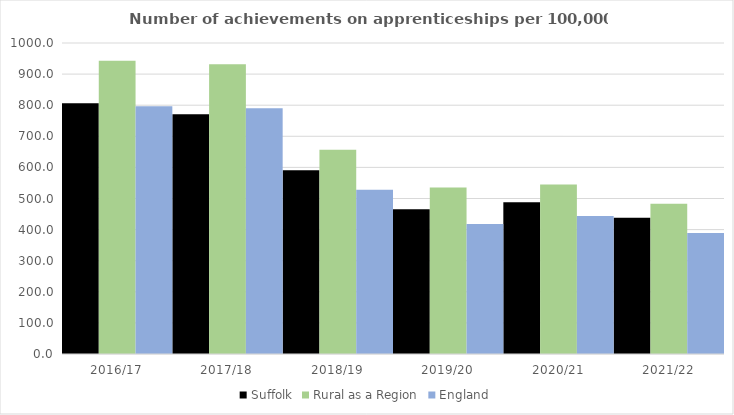
| Category | Suffolk | Rural as a Region | England |
|---|---|---|---|
| 2016/17 | 806.322 | 942.594 | 797 |
| 2017/18 | 771.191 | 931.709 | 790 |
| 2018/19 | 590.568 | 656.44 | 528 |
| 2019/20 | 465.823 | 535.552 | 418 |
| 2020/21 | 487.765 | 545.333 | 444 |
| 2021/22 | 438.498 | 482.936 | 389 |